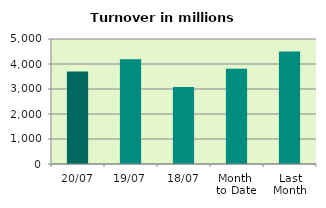
| Category | Series 0 |
|---|---|
| 20/07 | 3703.036 |
| 19/07 | 4188.197 |
| 18/07 | 3079.229 |
| Month 
to Date | 3814.422 |
| Last
Month | 4502.251 |